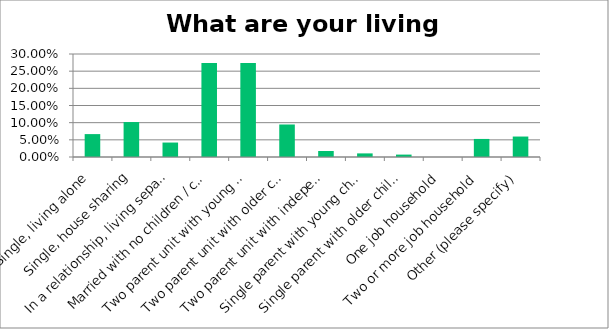
| Category | Responses |
|---|---|
| Single, living alone | 0.067 |
| Single, house sharing | 0.102 |
| In a relationship, living separately | 0.042 |
| Married with no children / cohabiting | 0.274 |
| Two parent unit with young children | 0.274 |
| Two parent unit with older children | 0.095 |
| Two parent unit with independent children | 0.018 |
| Single parent with young children | 0.01 |
| Single parent with older children | 0.007 |
| One job household | 0 |
| Two or more job household | 0.053 |
| Other (please specify) | 0.06 |